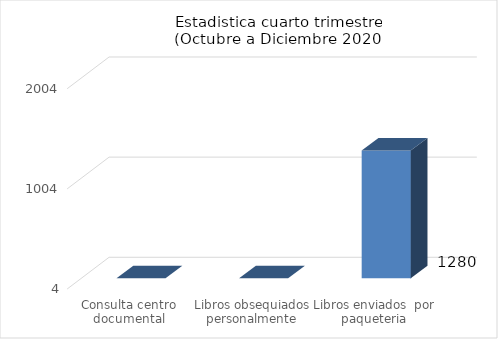
| Category | Julio a Septiembre |
|---|---|
| Consulta centro documental | 0 |
| Libros obsequiados personalmente | 0 |
| Libros enviados  por paqueteria | 1280 |